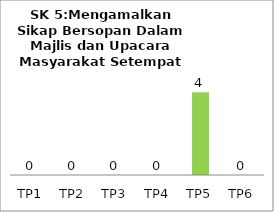
| Category | Bil Pel |
|---|---|
| TP1 | 0 |
| TP2 | 0 |
| TP3 | 0 |
| TP4 | 0 |
| TP5 | 4 |
| TP6 | 0 |